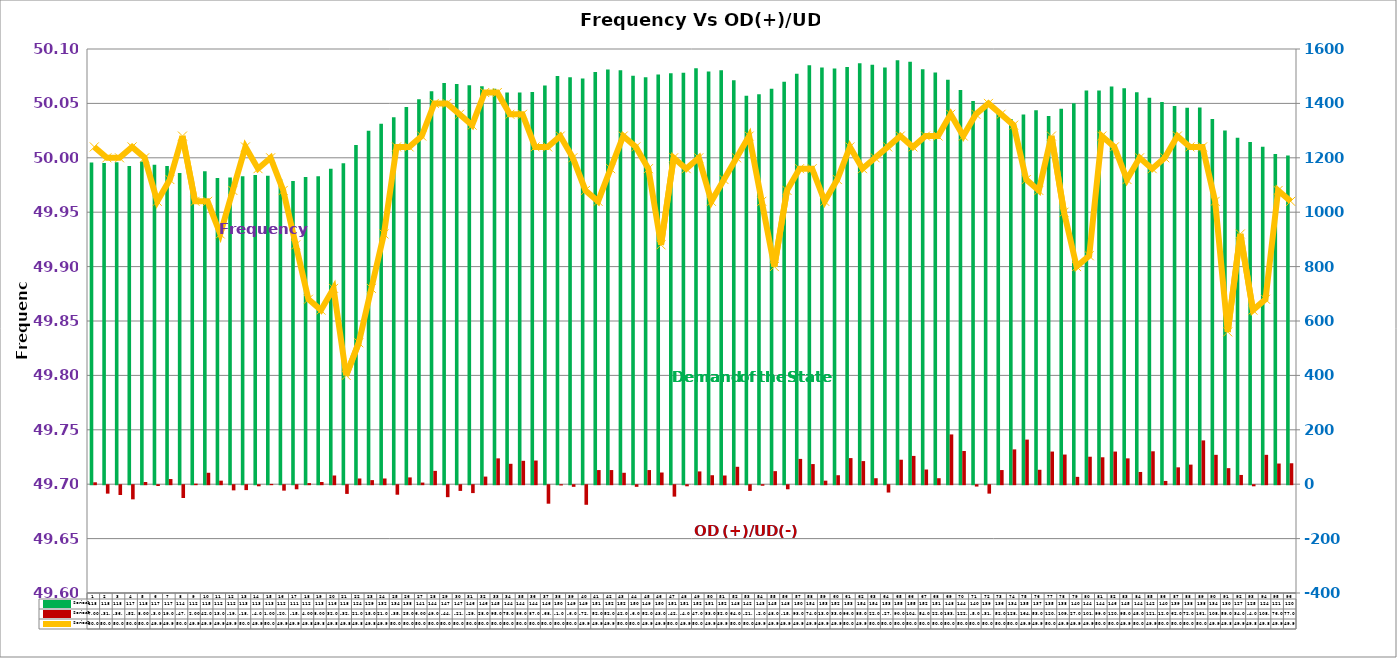
| Category | Series 2 | Series 4 |
|---|---|---|
| 0 | 1183 | 7 |
| 1 | 1181 | -31 |
| 2 | 1184 | -36 |
| 3 | 1170 | -52 |
| 4 | 1186 | 8 |
| 5 | 1174 | -3 |
| 6 | 1170 | 19 |
| 7 | 1144 | -47 |
| 8 | 1123 | 2 |
| 9 | 1151 | 42 |
| 10 | 1126 | 13 |
| 11 | 1128 | -19 |
| 12 | 1132 | -18 |
| 13 | 1137 | -4 |
| 14 | 1134 | 1 |
| 15 | 1122 | -20 |
| 16 | 1115 | -15 |
| 17 | 1129 | 4 |
| 18 | 1132 | 8 |
| 19 | 1160 | 32 |
| 20 | 1180 | -32 |
| 21 | 1247 | 21 |
| 22 | 1299 | 15 |
| 23 | 1325 | 21 |
| 24 | 1349 | -35 |
| 25 | 1387 | 25 |
| 26 | 1415 | 6 |
| 27 | 1445 | 49 |
| 28 | 1475 | -44 |
| 29 | 1471 | -21 |
| 30 | 1467 | -29 |
| 31 | 1463 | 28 |
| 32 | 1454 | 95 |
| 33 | 1440 | 75 |
| 34 | 1440 | 86 |
| 35 | 1442 | 87 |
| 36 | 1466 | -68 |
| 37 | 1501 | -1 |
| 38 | 1496 | -6 |
| 39 | 1492 | -72 |
| 40 | 1515 | 52 |
| 41 | 1525 | 52 |
| 42 | 1522 | 42 |
| 43 | 1502 | -6 |
| 44 | 1496 | 52 |
| 45 | 1506 | 43 |
| 46 | 1511 | -42 |
| 47 | 1513 | -4 |
| 48 | 1529 | 47 |
| 49 | 1517 | 33 |
| 50 | 1522 | 32 |
| 51 | 1485 | 64 |
| 52 | 1428 | -21 |
| 53 | 1434 | -2 |
| 54 | 1454 | 48 |
| 55 | 1480 | -15 |
| 56 | 1509 | 93 |
| 57 | 1540 | 74 |
| 58 | 1532 | 13 |
| 59 | 1528 | 33 |
| 60 | 1534 | 96 |
| 61 | 1548 | 85 |
| 62 | 1542 | 22 |
| 63 | 1532 | -27 |
| 64 | 1559 | 90 |
| 65 | 1553 | 104 |
| 66 | 1526 | 54 |
| 67 | 1514 | 22 |
| 68 | 1487 | 183 |
| 69 | 1449 | 122 |
| 70 | 1409 | -5 |
| 71 | 1393 | -31 |
| 72 | 1365 | 52 |
| 73 | 1343 | 128 |
| 74 | 1359 | 164 |
| 75 | 1375 | 53 |
| 76 | 1354 | 120 |
| 77 | 1380 | 109 |
| 78 | 1401 | 27 |
| 79 | 1447 | 101 |
| 80 | 1447 | 99 |
| 81 | 1462 | 120 |
| 82 | 1456 | 95 |
| 83 | 1441 | 45 |
| 84 | 1421 | 121 |
| 85 | 1405 | 12 |
| 86 | 1390 | 62 |
| 87 | 1384 | 72 |
| 88 | 1385 | 161 |
| 89 | 1343 | 108 |
| 90 | 1300 | 59 |
| 91 | 1274 | 34 |
| 92 | 1258 | -4 |
| 93 | 1241 | 108 |
| 94 | 1214 | 76 |
| 95 | 1208 | 77 |